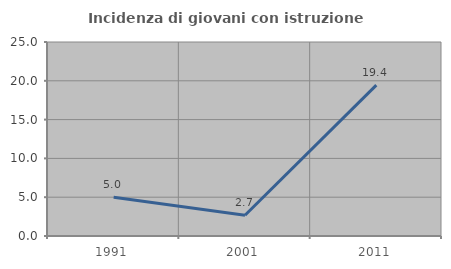
| Category | Incidenza di giovani con istruzione universitaria |
|---|---|
| 1991.0 | 5 |
| 2001.0 | 2.679 |
| 2011.0 | 19.444 |